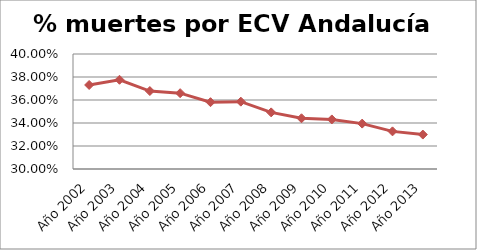
| Category | Series 0 |
|---|---|
| Año 2002 | 0.373 |
| Año 2003 | 0.378 |
| Año 2004 | 0.368 |
| Año 2005 | 0.366 |
| Año 2006 | 0.358 |
| Año 2007 | 0.359 |
| Año 2008 | 0.349 |
| Año 2009 | 0.344 |
| Año 2010 | 0.343 |
| Año 2011 | 0.339 |
| Año 2012 | 0.333 |
| Año 2013 | 0.33 |